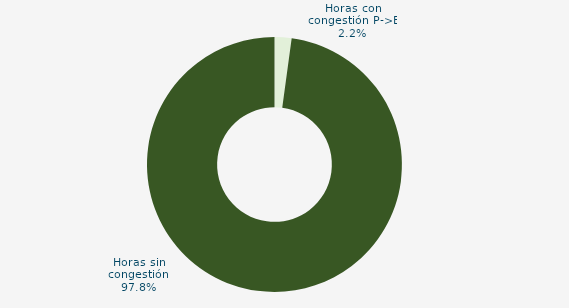
| Category | Horas con congestión E->P |
|---|---|
| Horas con congestión E->P | 0 |
| Horas con congestión P->E | 2.151 |
| Horas sin congestión | 97.849 |